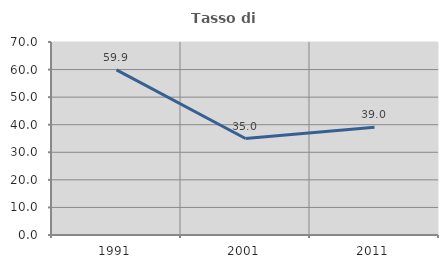
| Category | Tasso di occupazione   |
|---|---|
| 1991.0 | 59.864 |
| 2001.0 | 35 |
| 2011.0 | 39.048 |